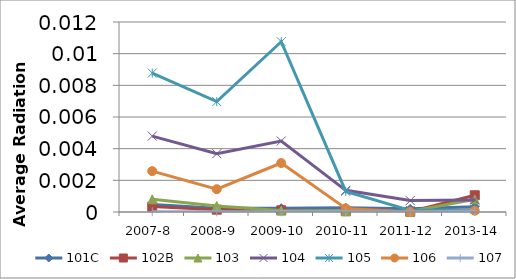
| Category | 101C | 102B | 103 | 104 | 105 | 106 | 107 |
|---|---|---|---|---|---|---|---|
| 2007-8 | 0 | 0 | 0.001 | 0.005 | 0.009 | 0.003 | 0 |
| 2008-9 | 0 | 0 | 0 | 0.004 | 0.007 | 0.001 | 0 |
| 2009-10 | 0 | 0 | 0 | 0.004 | 0.011 | 0.003 | 0 |
| 2010-11 | 0 | 0 | 0 | 0.001 | 0.001 | 0 | 0 |
| 2011-12 | 0 | 0 | 0 | 0.001 | 0 | 0 | 0 |
| 2013-14 | 0 | 0.001 | 0.001 | 0.001 | 0 | 0 | 0 |